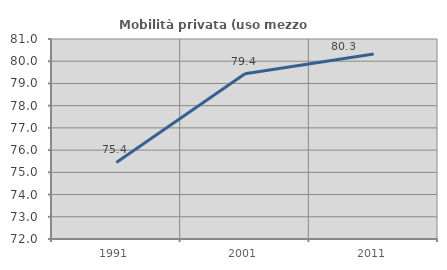
| Category | Mobilità privata (uso mezzo privato) |
|---|---|
| 1991.0 | 75.445 |
| 2001.0 | 79.437 |
| 2011.0 | 80.328 |